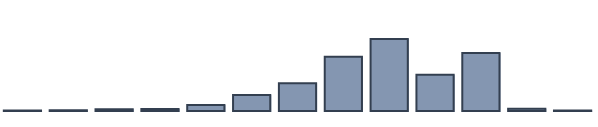
| Category | Series 0 |
|---|---|
| 0 | 0.152 |
| 1 | 0.227 |
| 2 | 0.606 |
| 3 | 0.682 |
| 4 | 2.121 |
| 5 | 5.758 |
| 6 | 10 |
| 7 | 19.545 |
| 8 | 25.909 |
| 9 | 13.106 |
| 10 | 20.909 |
| 11 | 0.833 |
| 12 | 0.152 |